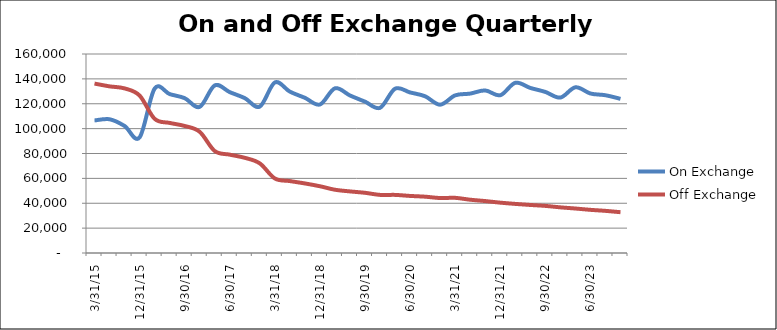
| Category | On Exchange | Off Exchange |
|---|---|---|
| 3/31/15 | 106563 | 136212 |
| 6/30/15 | 107521 | 133989 |
| 9/30/15 | 102138 | 132342 |
| 12/31/15 | 92984 | 126594 |
| 3/31/16 | 132157 | 107889 |
| 6/30/16 | 127767 | 104595 |
| 9/30/16 | 124497 | 102147 |
| 12/31/16 | 117489 | 97440 |
| 3/31/17 | 134734 | 81982 |
| 6/30/17 | 129334 | 79070 |
| 9/30/17 | 124521 | 76535 |
| 12/31/17 | 117714 | 72033 |
| 3/31/18 | 137109 | 59928 |
| 6/30/18 | 129730 | 57839 |
| 9/30/18 | 124762 | 55928 |
| 12/31/18 | 119405 | 53672 |
| 3/31/19 | 132430 | 50859 |
| 6/30/19 | 126646 | 49518 |
| 9/30/19 | 121689 | 48398 |
| 12/31/19 | 116724 | 46713 |
| 3/31/20 | 132103 | 46718 |
| 6/30/20 | 129092 | 45880 |
| 9/30/20 | 126003 | 45283 |
| 12/31/20 | 119243 | 44179 |
| 3/31/21 | 126753 | 44349 |
| 6/30/21 | 128167 | 42840 |
| 9/30/21 | 130702 | 41751 |
| 12/31/21 | 126845 | 40476 |
| 3/31/22 | 136844 | 39468 |
| 6/30/22 | 132710 | 38627 |
| 9/30/22 | 129496 | 37873 |
| 12/31/22 | 124977 | 36702 |
| 3/31/23 | 133230 | 35763 |
| 6/30/23 | 128230 | 34699 |
| 9/30/23 | 126844 | 33879 |
| 12/31/23 | 123937 | 32798 |